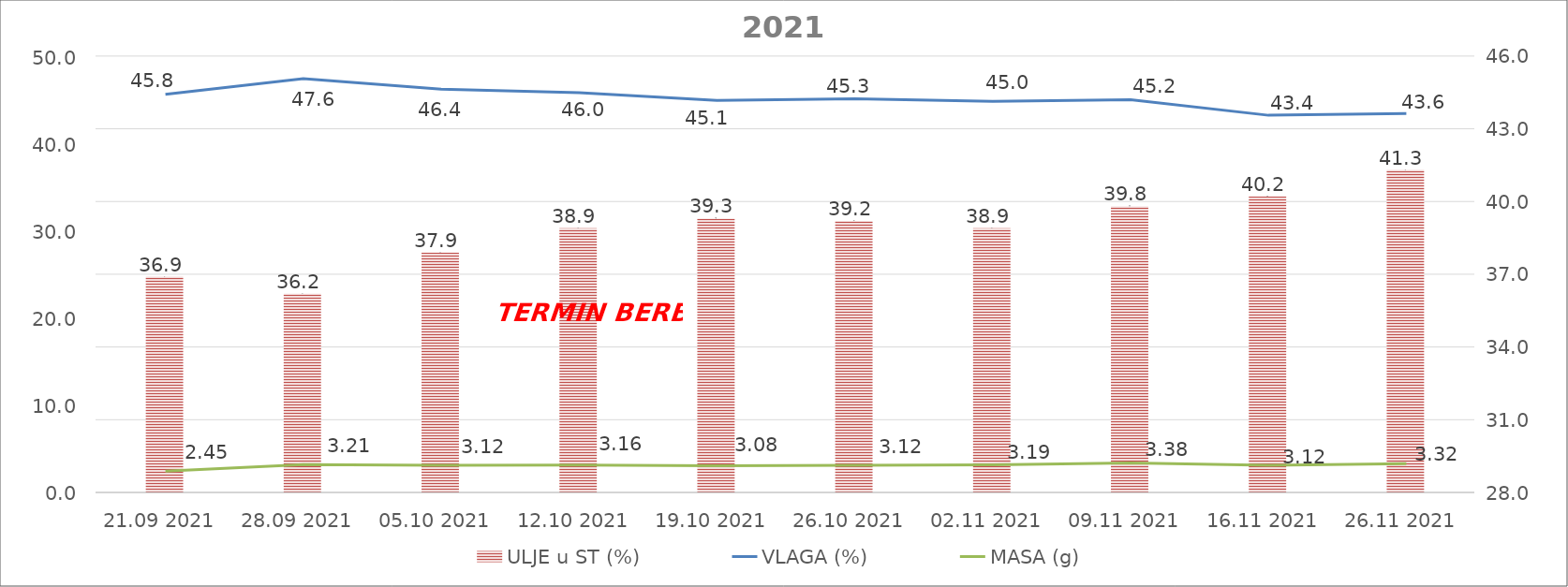
| Category | ULJE u ST (%) |
|---|---|
| 21.09 2021 | 36.9 |
| 28.09 2021 | 36.2 |
| 05.10 2021 | 37.9 |
| 12.10 2021 | 38.9 |
| 19.10 2021 | 39.3 |
| 26.10 2021 | 39.2 |
| 02.11 2021 | 38.9 |
| 09.11 2021 | 39.8 |
| 16.11 2021 | 40.2 |
| 26.11 2021 | 41.3 |